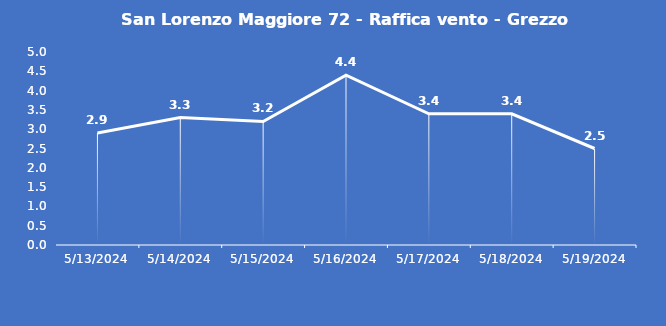
| Category | San Lorenzo Maggiore 72 - Raffica vento - Grezzo (m/s) |
|---|---|
| 5/13/24 | 2.9 |
| 5/14/24 | 3.3 |
| 5/15/24 | 3.2 |
| 5/16/24 | 4.4 |
| 5/17/24 | 3.4 |
| 5/18/24 | 3.4 |
| 5/19/24 | 2.5 |